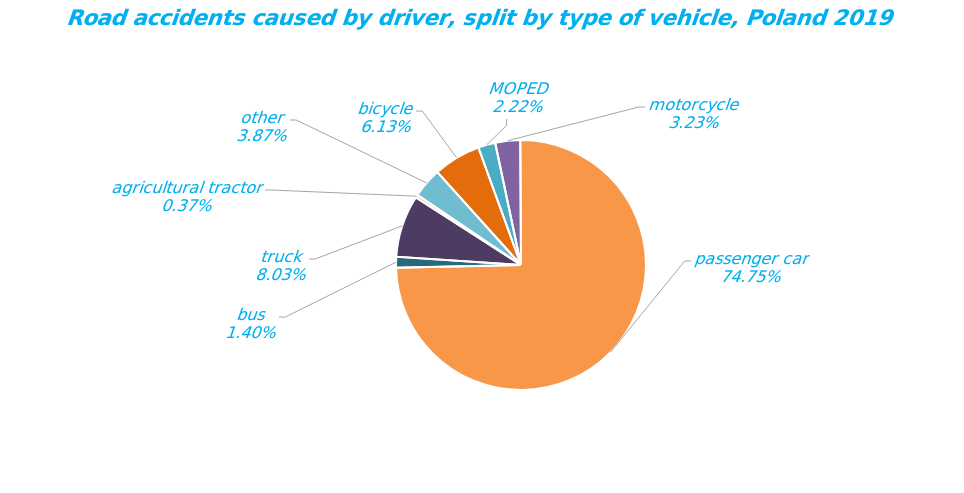
| Category | Series 0 |
|---|---|
| bicycle | 1626 |
| MOPED | 590 |
| motorcycle | 856 |
| passenger car | 19833 |
| bus | 372 |
| truck | 2131 |
| agricultural tractor | 99 |
| other | 1027 |